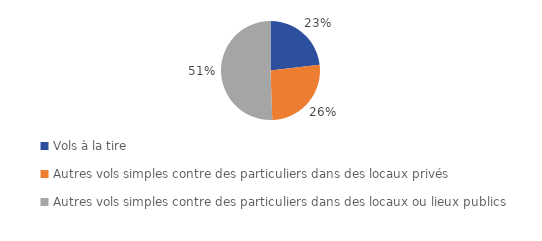
| Category | Series 0 |
|---|---|
| Vols à la tire | 165553 |
| Autres vols simples contre des particuliers dans des locaux privés
 | 188182 |
| Autres vols simples contre des particuliers dans des locaux ou lieux publics | 361996 |